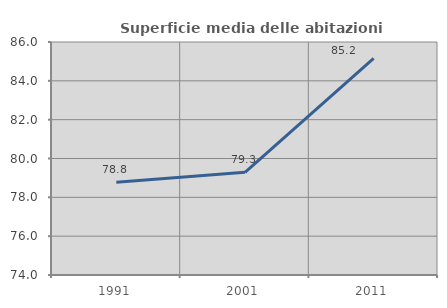
| Category | Superficie media delle abitazioni occupate |
|---|---|
| 1991.0 | 78.775 |
| 2001.0 | 79.287 |
| 2011.0 | 85.156 |